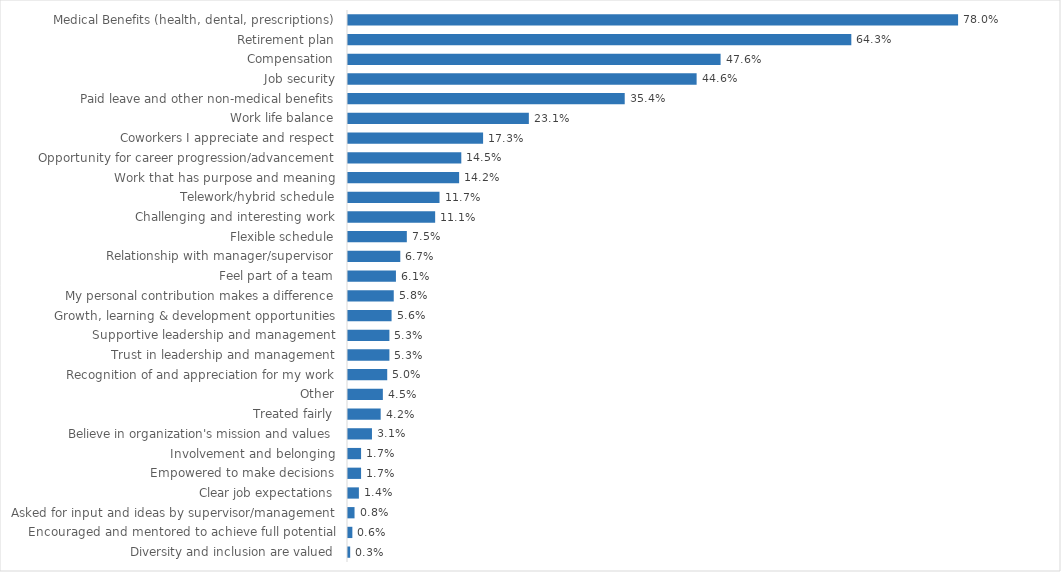
| Category | Corrections |
|---|---|
| Medical Benefits (health, dental, prescriptions) | 0.78 |
| Retirement plan | 0.643 |
| Compensation | 0.476 |
| Job security | 0.446 |
| Paid leave and other non-medical benefits | 0.354 |
| Work life balance | 0.231 |
| Coworkers I appreciate and respect | 0.173 |
| Opportunity for career progression/advancement | 0.145 |
| Work that has purpose and meaning | 0.142 |
| Telework/hybrid schedule | 0.117 |
| Challenging and interesting work | 0.111 |
| Flexible schedule | 0.075 |
| Relationship with manager/supervisor | 0.067 |
| Feel part of a team | 0.061 |
| My personal contribution makes a difference | 0.058 |
| Growth, learning & development opportunities | 0.056 |
| Supportive leadership and management | 0.053 |
| Trust in leadership and management | 0.053 |
| Recognition of and appreciation for my work | 0.05 |
| Other | 0.045 |
| Treated fairly | 0.042 |
| Believe in organization's mission and values | 0.031 |
| Involvement and belonging | 0.017 |
| Empowered to make decisions | 0.017 |
| Clear job expectations | 0.014 |
| Asked for input and ideas by supervisor/management | 0.008 |
| Encouraged and mentored to achieve full potential | 0.006 |
| Diversity and inclusion are valued | 0.003 |